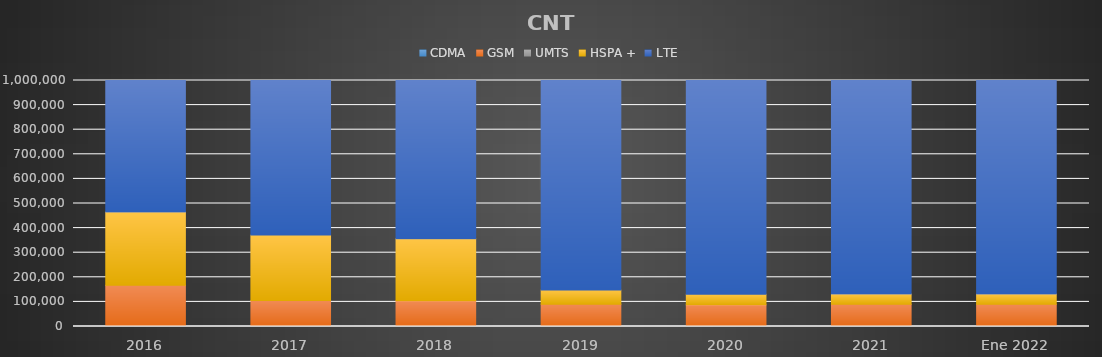
| Category | CDMA | GSM | UMTS | HSPA + | LTE |
|---|---|---|---|---|---|
| 2016 | 0 | 167794 | 0 | 297924 | 1075501 |
| 2017 | 0 | 105840 | 0 | 265966 | 1770311 |
| 2018 | 0 | 104907 | 0 | 252233 | 2488002 |
| 2019 | 0 | 90785 | 0 | 57576 | 2755329 |
| 2020 | 0 | 88328 | 0 | 42633 | 2695427 |
| 2021 | 0 | 90490 | 0 | 41720 | 2737207 |
| Ene 2022 | 0 | 90494 | 0 | 41783 | 2747791 |